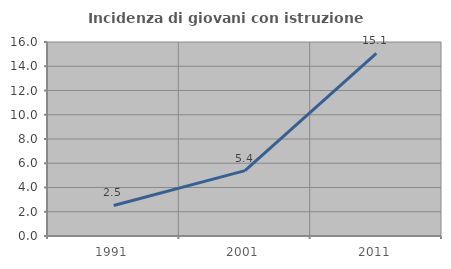
| Category | Incidenza di giovani con istruzione universitaria |
|---|---|
| 1991.0 | 2.516 |
| 2001.0 | 5.389 |
| 2011.0 | 15.054 |